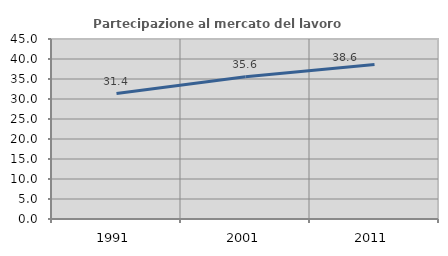
| Category | Partecipazione al mercato del lavoro  femminile |
|---|---|
| 1991.0 | 31.373 |
| 2001.0 | 35.556 |
| 2011.0 | 38.636 |